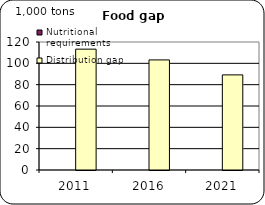
| Category | Nutritional requirements | Distribution gap |
|---|---|---|
| 2011.0 | 0 | 113.297 |
| 2016.0 | 0 | 103.204 |
| 2021.0 | 0 | 89.176 |